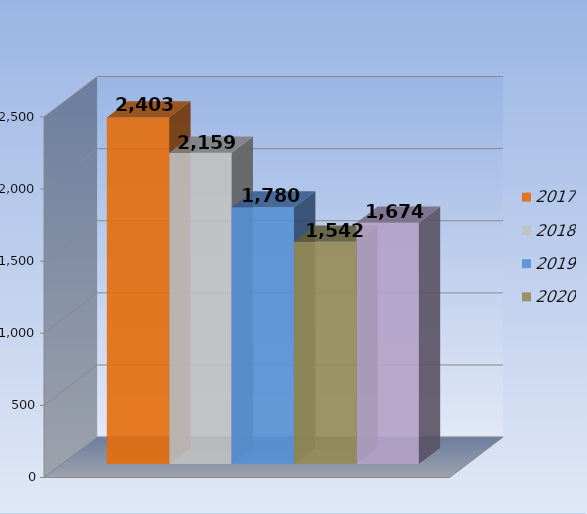
| Category | 2017 | 2018 | 2019 | 2020 | 2021 |
|---|---|---|---|---|---|
| 0 | 2403 | 2159 | 1780 | 1542 | 1674 |